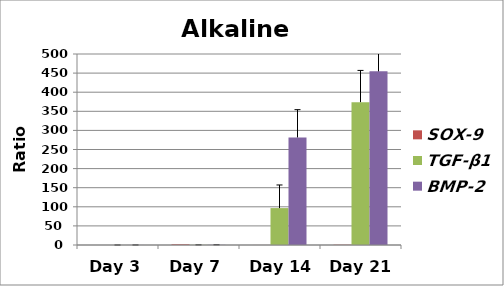
| Category | SOX-9 | TGF-β1 | BMP-2 |
|---|---|---|---|
| Day 3 | 0 | 0.001 | 0.102 |
| Day 7 | 1.715 | 0.307 | 0.468 |
| Day 14 | 0.117 | 96.61 | 281.599 |
| Day 21 | 0.706 | 373.946 | 454.53 |